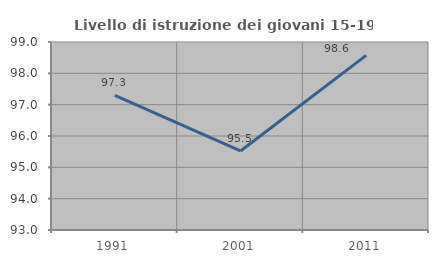
| Category | Livello di istruzione dei giovani 15-19 anni |
|---|---|
| 1991.0 | 97.297 |
| 2001.0 | 95.522 |
| 2011.0 | 98.571 |